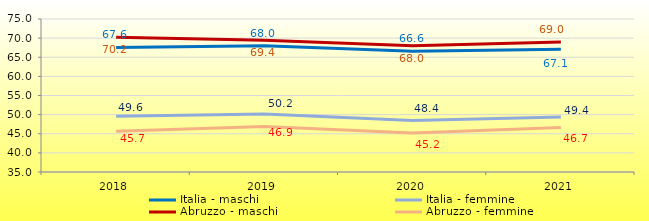
| Category | Italia - maschi | Italia - femmine | Abruzzo - maschi | Abruzzo - femmine |
|---|---|---|---|---|
| 2018 | 67.558 | 49.55 | 70.244 | 45.675 |
| 2019 | 67.978 | 50.174 | 69.436 | 46.927 |
| 2020 | 66.55 | 48.435 | 68.022 | 45.213 |
| 2021 | 67.079 | 49.408 | 68.96 | 46.651 |